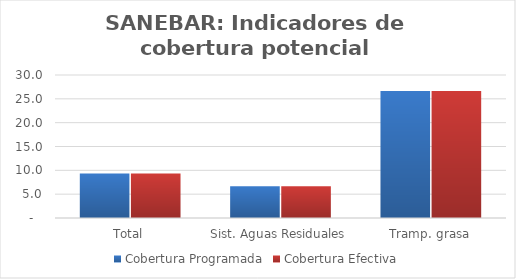
| Category | Cobertura Programada | Cobertura Efectiva |
|---|---|---|
| Total | 9.356 | 9.341 |
| Sist. Aguas Residuales | 6.667 | 6.649 |
| Tramp. grasa | 26.667 | 26.667 |